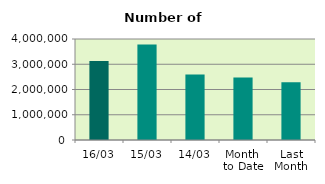
| Category | Series 0 |
|---|---|
| 16/03 | 3131568 |
| 15/03 | 3778340 |
| 14/03 | 2590022 |
| Month 
to Date | 2475265 |
| Last
Month | 2290810.7 |